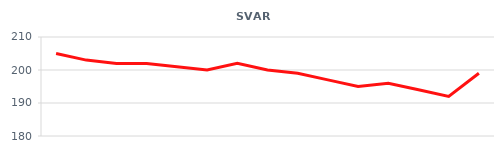
| Category | Series 0 |
|---|---|
| 2012-06-01 | 205 |
| 2012-06-02 | 203 |
| 2012-06-03 | 202 |
| 2012-06-04 | 202 |
| 2012-06-05 | 201 |
| 2012-06-06 | 200 |
| 2012-06-07 | 202 |
| 2012-06-08 | 200 |
| 2012-06-09 | 199 |
| 2012-06-10 | 197 |
| 2012-06-11 | 195 |
| 2012-06-12 | 196 |
| 2012-06-13 | 194 |
| 2012-06-14 | 192 |
| 2012-06-15 | 199 |